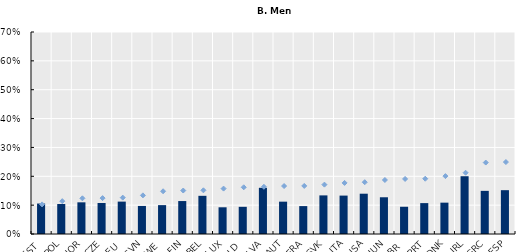
| Category | Mid-1990s |
|---|---|
| EST | 0.106 |
| POL | 0.104 |
| NOR | 0.11 |
| CZE | 0.107 |
| DEU | 0.112 |
| SVN | 0.097 |
| SWE | 0.1 |
| FIN | 0.114 |
| BEL | 0.132 |
| LUX | 0.093 |
| NLD | 0.094 |
| LVA | 0.16 |
| AUT | 0.112 |
| FRA | 0.097 |
| SVK | 0.134 |
| ITA | 0.133 |
| USA | 0.14 |
| HUN | 0.127 |
| GBR | 0.094 |
| PRT | 0.107 |
| DNK | 0.109 |
| IRL | 0.2 |
| GRC | 0.149 |
| ESP | 0.152 |